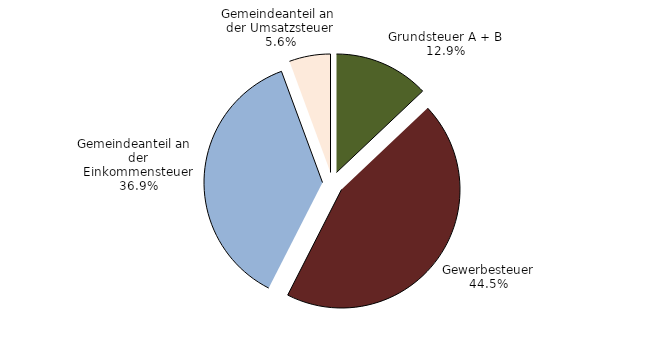
| Category | Series 0 |
|---|---|
| Grundsteuer A + B | 0.129 |
| Gewerbesteuer | 0.445 |
| Gemeindeanteil an  
der Einkommensteuer | 0.369 |
| Gemeindeanteil an 
der Umsatzsteuer | 0.056 |